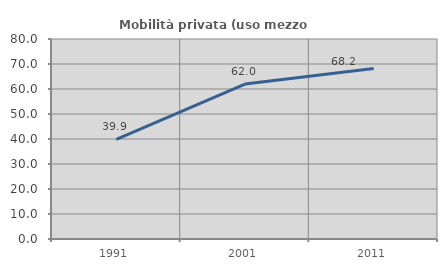
| Category | Mobilità privata (uso mezzo privato) |
|---|---|
| 1991.0 | 39.888 |
| 2001.0 | 61.97 |
| 2011.0 | 68.219 |